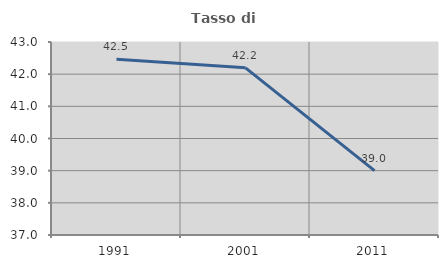
| Category | Tasso di occupazione   |
|---|---|
| 1991.0 | 42.466 |
| 2001.0 | 42.198 |
| 2011.0 | 39.003 |